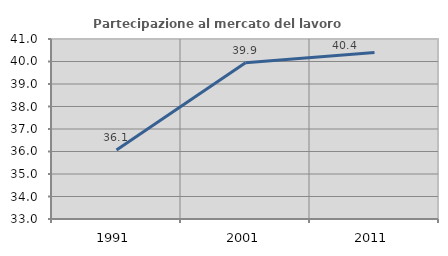
| Category | Partecipazione al mercato del lavoro  femminile |
|---|---|
| 1991.0 | 36.066 |
| 2001.0 | 39.942 |
| 2011.0 | 40.401 |